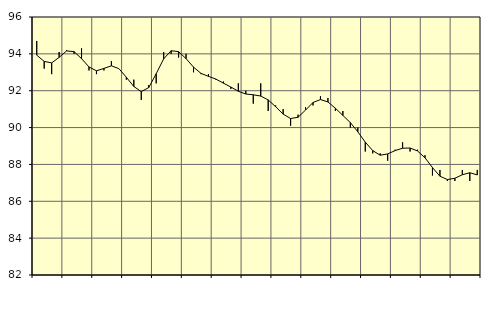
| Category | Piggar | Series 1 |
|---|---|---|
| nan | 94.7 | 93.93 |
| 1.0 | 93.2 | 93.59 |
| 1.0 | 92.9 | 93.51 |
| 1.0 | 94.1 | 93.81 |
| nan | 94.2 | 94.16 |
| 2.0 | 94 | 94.12 |
| 2.0 | 94.3 | 93.74 |
| 2.0 | 93.1 | 93.29 |
| nan | 92.9 | 93.08 |
| 3.0 | 93.1 | 93.21 |
| 3.0 | 93.6 | 93.35 |
| 3.0 | 93.2 | 93.2 |
| nan | 92.6 | 92.73 |
| 4.0 | 92.6 | 92.23 |
| 4.0 | 91.5 | 91.95 |
| 4.0 | 92.3 | 92.17 |
| nan | 92.4 | 92.92 |
| 5.0 | 94.1 | 93.73 |
| 5.0 | 94 | 94.17 |
| 5.0 | 93.8 | 94.12 |
| nan | 94 | 93.74 |
| 6.0 | 93 | 93.28 |
| 6.0 | 92.9 | 92.94 |
| 6.0 | 92.9 | 92.78 |
| nan | 92.6 | 92.63 |
| 7.0 | 92.5 | 92.41 |
| 7.0 | 92.1 | 92.2 |
| 7.0 | 92.4 | 91.97 |
| nan | 92 | 91.82 |
| 8.0 | 91.3 | 91.78 |
| 8.0 | 92.4 | 91.71 |
| 8.0 | 90.9 | 91.5 |
| nan | 91.2 | 91.13 |
| 9.0 | 91 | 90.73 |
| 9.0 | 90.1 | 90.49 |
| 9.0 | 90.7 | 90.56 |
| nan | 91.1 | 90.95 |
| 10.0 | 91.2 | 91.36 |
| 10.0 | 91.7 | 91.52 |
| 10.0 | 91.6 | 91.39 |
| nan | 90.9 | 91.05 |
| 11.0 | 90.9 | 90.66 |
| 11.0 | 90 | 90.27 |
| 11.0 | 90 | 89.77 |
| nan | 88.7 | 89.21 |
| 12.0 | 88.6 | 88.75 |
| 12.0 | 88.6 | 88.5 |
| 12.0 | 88.2 | 88.57 |
| nan | 88.8 | 88.75 |
| 13.0 | 89.2 | 88.88 |
| 13.0 | 88.7 | 88.89 |
| 13.0 | 88.8 | 88.73 |
| nan | 88.5 | 88.36 |
| 14.0 | 87.4 | 87.83 |
| 14.0 | 87.7 | 87.36 |
| 14.0 | 87.1 | 87.18 |
| nan | 87.1 | 87.25 |
| 15.0 | 87.7 | 87.44 |
| 15.0 | 87.1 | 87.55 |
| 15.0 | 87.7 | 87.43 |